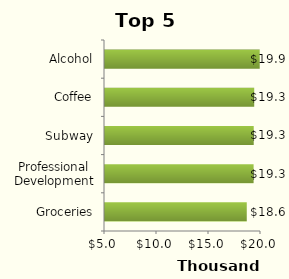
| Category | Final Amount  |
|---|---|
| Groceries | 18631.779 |
| Professional Development | 19288.295 |
| Subway | 19300.271 |
| Coffee | 19348.176 |
| Alcohol | 19877.309 |